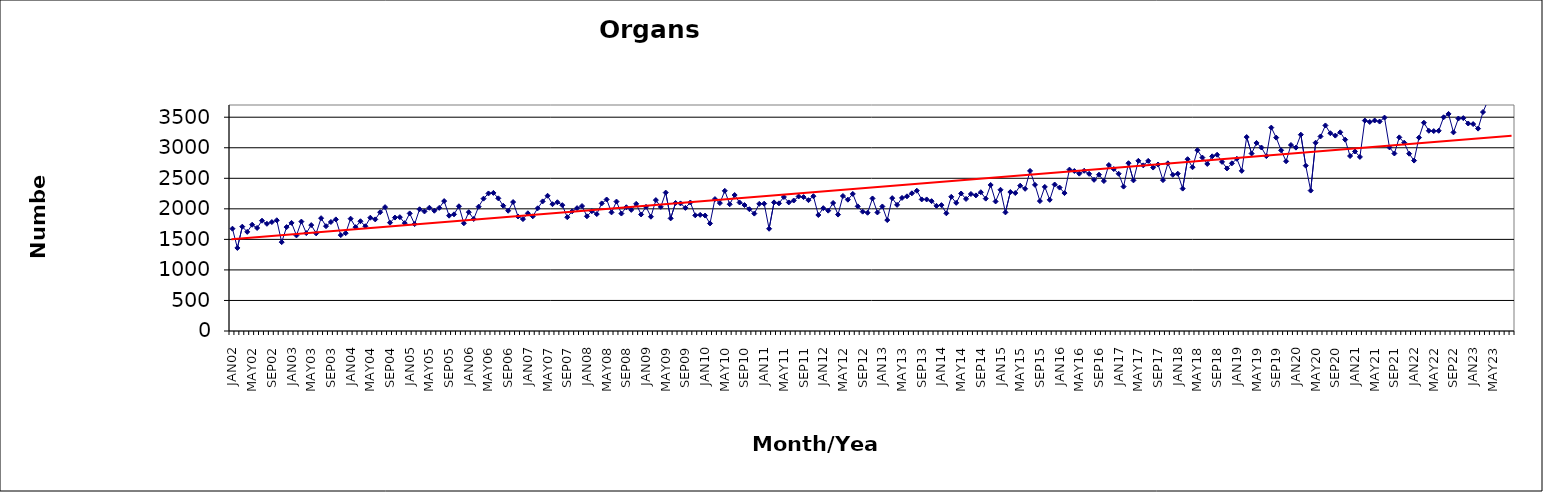
| Category | Series 0 |
|---|---|
| JAN02 | 1675 |
| FEB02 | 1360 |
| MAR02 | 1708 |
| APR02 | 1623 |
| MAY02 | 1740 |
| JUN02 | 1687 |
| JUL02 | 1806 |
| AUG02 | 1755 |
| SEP02 | 1783 |
| OCT02 | 1813 |
| NOV02 | 1455 |
| DEC02 | 1701 |
| JAN03 | 1770 |
| FEB03 | 1565 |
| MAR03 | 1791 |
| APR03 | 1603 |
| MAY03 | 1734 |
| JUN03 | 1598 |
| JUL03 | 1847 |
| AUG03 | 1716 |
| SEP03 | 1785 |
| OCT03 | 1827 |
| NOV03 | 1570 |
| DEC03 | 1602 |
| JAN04 | 1839 |
| FEB04 | 1700 |
| MAR04 | 1797 |
| APR04 | 1715 |
| MAY04 | 1855 |
| JUN04 | 1827 |
| JUL04 | 1945 |
| AUG04 | 2028 |
| SEP04 | 1773 |
| OCT04 | 1857 |
| NOV04 | 1864 |
| DEC04 | 1766 |
| JAN05 | 1925 |
| FEB05 | 1750 |
| MAR05 | 1993 |
| APR05 | 1957 |
| MAY05 | 2018 |
| JUN05 | 1969 |
| JUL05 | 2016 |
| AUG05 | 2127 |
| SEP05 | 1888 |
| OCT05 | 1910 |
| NOV05 | 2042 |
| DEC05 | 1764 |
| JAN06 | 1945 |
| FEB06 | 1834 |
| MAR06 | 2035 |
| APR06 | 2167 |
| MAY06 | 2252 |
| JUN06 | 2261 |
| JUL06 | 2172 |
| AUG06 | 2051 |
| SEP06 | 1969 |
| OCT06 | 2111 |
| NOV06 | 1875 |
| DEC06 | 1832 |
| JAN07 | 1927 |
| FEB07 | 1878 |
| MAR07 | 2009 |
| APR07 | 2122 |
| MAY07 | 2214 |
| JUN07 | 2076 |
| JUL07 | 2108 |
| AUG07 | 2060 |
| SEP07 | 1863 |
| OCT07 | 1959 |
| NOV07 | 2012 |
| DEC07 | 2046 |
| JAN08 | 1878 |
| FEB08 | 1962 |
| MAR08 | 1914 |
| APR08 | 2089 |
| MAY08 | 2153 |
| JUN08 | 1942 |
| JUL08 | 2119 |
| AUG08 | 1923 |
| SEP08 | 2026 |
| OCT08 | 1983 |
| NOV08 | 2082 |
| DEC08 | 1908 |
| JAN09 | 2033 |
| FEB09 | 1871 |
| MAR09 | 2143 |
| APR09 | 2032 |
| MAY09 | 2266 |
| JUN09 | 1844 |
| JUL09 | 2096 |
| AUG09 | 2089 |
| SEP09 | 2016 |
| OCT09 | 2104 |
| NOV09 | 1894 |
| DEC09 | 1901 |
| JAN10 | 1890 |
| FEB10 | 1761 |
| MAR10 | 2160 |
| APR10 | 2094 |
| MAY10 | 2295 |
| JUN10 | 2075 |
| JUL10 | 2226 |
| AUG10 | 2104 |
| SEP10 | 2062 |
| OCT10 | 1994 |
| NOV10 | 1922 |
| DEC10 | 2082 |
| JAN11 | 2085 |
| FEB11 | 1674 |
| MAR11 | 2106 |
| APR11 | 2090 |
| MAY11 | 2194 |
| JUN11 | 2105 |
| JUL11 | 2136 |
| AUG11 | 2202 |
| SEP11 | 2192 |
| OCT11 | 2142 |
| NOV11 | 2207 |
| DEC11 | 1899 |
| JAN12 | 2011 |
| FEB12 | 1970 |
| MAR12 | 2096 |
| APR12 | 1906 |
| MAY12 | 2210 |
| JUN12 | 2150 |
| JUL12 | 2244 |
| AUG12 | 2041 |
| SEP12 | 1954 |
| OCT12 | 1936 |
| NOV12 | 2170 |
| DEC12 | 1941 |
| JAN13 | 2039 |
| FEB13 | 1816 |
| MAR13 | 2175 |
| APR13 | 2065 |
| MAY13 | 2179 |
| JUN13 | 2205 |
| JUL13 | 2254 |
| AUG13 | 2297 |
| SEP13 | 2154 |
| OCT13 | 2154 |
| NOV13 | 2126 |
| DEC13 | 2049 |
| JAN14 | 2061 |
| FEB14 | 1927 |
| MAR14 | 2197 |
| APR14 | 2098 |
| MAY14 | 2251 |
| JUN14 | 2162 |
| JUL14 | 2243 |
| AUG14 | 2220 |
| SEP14 | 2272 |
| OCT14 | 2167 |
| NOV14 | 2391 |
| DEC14 | 2121 |
| JAN15 | 2312 |
| FEB15 | 1942 |
| MAR15 | 2275 |
| APR15 | 2259 |
| MAY15 | 2379 |
| JUN15 | 2328 |
| JUL15 | 2621 |
| AUG15 | 2393 |
| SEP15 | 2127 |
| OCT15 | 2359 |
| NOV15 | 2147 |
| DEC15 | 2398 |
| JAN16 | 2348 |
| FEB16 | 2258 |
| MAR16 | 2642 |
| APR16 | 2619 |
| MAY16 | 2576 |
| JUN16 | 2623 |
| JUL16 | 2573 |
| AUG16 | 2475 |
| SEP16 | 2559 |
| OCT16 | 2455 |
| NOV16 | 2717 |
| DEC16 | 2652 |
| JAN17 | 2574 |
| FEB17 | 2364 |
| MAR17 | 2747 |
| APR17 | 2466 |
| MAY17 | 2786 |
| JUN17 | 2712 |
| JUL17 | 2785 |
| AUG17 | 2676 |
| SEP17 | 2726 |
| OCT17 | 2470 |
| NOV17 | 2745 |
| DEC17 | 2557 |
| JAN18 | 2575 |
| FEB18 | 2331 |
| MAR18 | 2813 |
| APR18 | 2681 |
| MAY18 | 2960 |
| JUN18 | 2839 |
| JUL18 | 2735 |
| AUG18 | 2860 |
| SEP18 | 2886 |
| OCT18 | 2769 |
| NOV18 | 2661 |
| DEC18 | 2745 |
| JAN19 | 2819 |
| FEB19 | 2622 |
| MAR19 | 3175 |
| APR19 | 2906 |
| MAY19 | 3079 |
| JUN19 | 3004 |
| JUL19 | 2863 |
| AUG19 | 3330 |
| SEP19 | 3166 |
| OCT19 | 2958 |
| NOV19 | 2779 |
| DEC19 | 3045 |
| JAN20 | 3002 |
| FEB20 | 3214 |
| MAR20 | 2707 |
| APR20 | 2299 |
| MAY20 | 3082 |
| JUN20 | 3185 |
| JUL20 | 3365 |
| AUG20 | 3238 |
| SEP20 | 3199 |
| OCT20 | 3253 |
| NOV20 | 3133 |
| DEC20 | 2865 |
| JAN21 | 2939 |
| FEB21 | 2850 |
| MAR21 | 3445 |
| APR21 | 3422 |
| MAY21 | 3446 |
| JUN21 | 3429 |
| JUL21 | 3494 |
| AUG21 | 3006 |
| SEP21 | 2906 |
| OCT21 | 3170 |
| NOV21 | 3083 |
| DEC21 | 2903 |
| JAN22 | 2790 |
| FEB22 | 3166 |
| MAR22 | 3410 |
| APR22 | 3278 |
| MAY22 | 3273 |
| JUN22 | 3278 |
| JUL22 | 3499 |
| AUG22 | 3554 |
| SEP22 | 3252 |
| OCT22 | 3478 |
| NOV22 | 3485 |
| DEC22 | 3397 |
| JAN23 | 3388 |
| FEB23 | 3313 |
| MAR23 | 3585 |
| APR23 | 3772 |
| MAY23 | 3909 |
| JUN23 | 3757 |
| JUL23 | 3821 |